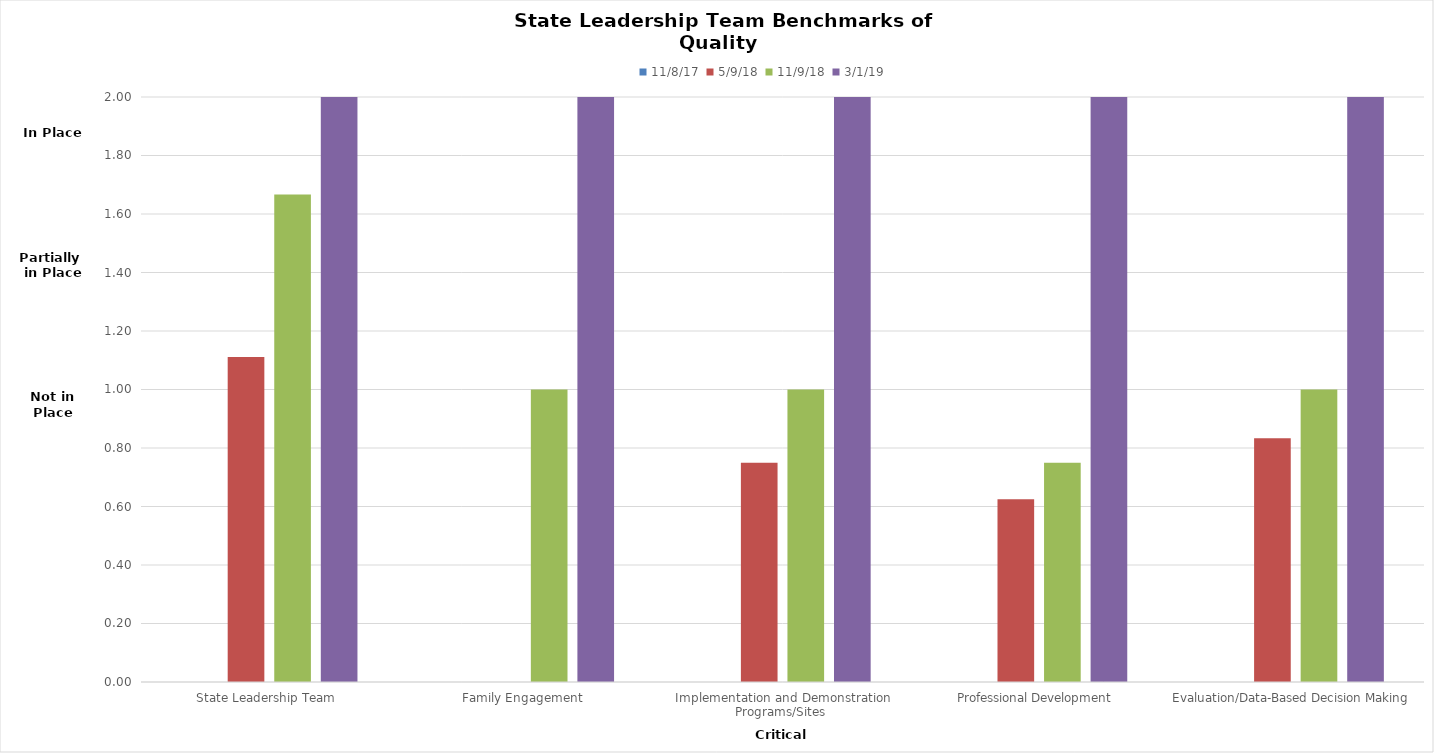
| Category | 11/8/17 | 5/9/18 | 11/9/18 | 3/1/19 |
|---|---|---|---|---|
| State Leadership Team  | 0 | 1.111 | 1.667 | 2 |
| Family Engagement  | 0 | 0 | 1 | 2 |
| Implementation and Demonstration Programs/Sites  | 0 | 0.75 | 1 | 2 |
| Professional Development  | 0 | 0.625 | 0.75 | 2 |
| Evaluation/Data-Based Decision Making  | 0 | 0.833 | 1 | 2 |